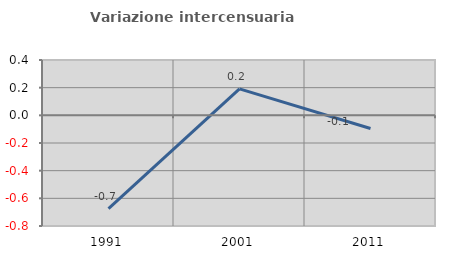
| Category | Variazione intercensuaria annua |
|---|---|
| 1991.0 | -0.675 |
| 2001.0 | 0.192 |
| 2011.0 | -0.095 |